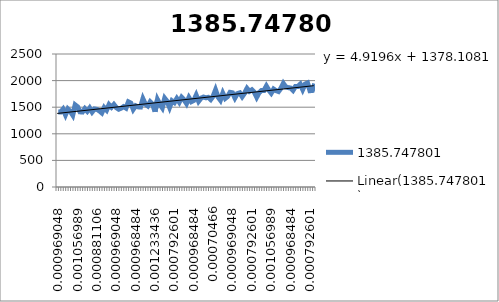
| Category | 1385.747801 |
|---|---|
| 0.000969047965337524 | 1409.71 |
| 0.000880542711958843 | 1408.997 |
| 0.000969047965337399 | 1462.603 |
| 0.000969047965337524 | 1357.679 |
| 0.00105698949098772 | 1467.266 |
| 0.00105698949098772 | 1421.77 |
| 0.0010569894909876 | 1351.802 |
| 0.000880542711958843 | 1542.5 |
| 0.00105698949098772 | 1507.457 |
| 0.000969047965337524 | 1412.852 |
| 0.0010569894909876 | 1408.801 |
| 0.000792601186308642 | 1472.939 |
| 0.000881106439687323 | 1423.314 |
| 0.000880542711958843 | 1484.858 |
| 0.000881106439687323 | 1409.553 |
| 0.000968484237609043 | 1467.141 |
| 0.000881106439687323 | 1459.688 |
| 0.000881106439687323 | 1430.484 |
| 0.000792601186308642 | 1392.604 |
| 0.000880542711958717 | 1493.375 |
| 0.000881106439687323 | 1445.967 |
| 0.00105698949098772 | 1547.773 |
| 0.000968484237609043 | 1499.581 |
| 0.000969047965337524 | 1550.429 |
| 0.000969047965337399 | 1492.231 |
| 0.00105698949098772 | 1462.196 |
| 0.000969047965337524 | 1481.269 |
| 0.000968484237609043 | 1510.302 |
| 0.000969047965337399 | 1482.758 |
| 0.000969047965337524 | 1600.337 |
| 0.000880542711958843 | 1578.2 |
| 0.000793164914037122 | 1460.535 |
| 0.000968484237609043 | 1526.82 |
| 0.000881106439687323 | 1506.313 |
| 0.000969047965337524 | 1503.179 |
| 0.000880542711958717 | 1655.981 |
| 0.000969047965337524 | 1557.419 |
| 0.000969047965337524 | 1523.858 |
| 0.000880542711958843 | 1601.222 |
| 0.000969047965337524 | 1553.901 |
| 0.00123343627001648 | 1416.081 |
| 0.000968484237609043 | 1642.636 |
| 0.000969047965337524 | 1555.288 |
| 0.000969047965337524 | 1489.379 |
| 0.000792601186308642 | 1667.171 |
| 0.000969047965337524 | 1609.043 |
| 0.000792601186308517 | 1497.294 |
| 0.000969047965337524 | 1620.021 |
| 0.000792601186308642 | 1586.993 |
| 0.000969047965337524 | 1662.9 |
| 0.000880542711958843 | 1595.267 |
| 0.000881106439687323 | 1685.742 |
| 0.000969047965337524 | 1639.141 |
| 0.000880542711958843 | 1569.628 |
| 0.0010569894909876 | 1679.928 |
| 0.000969047965337524 | 1604.396 |
| 0.000968484237609043 | 1626.188 |
| 0.000969047965337524 | 1725.29 |
| 0.0010569894909876 | 1611.026 |
| 0.000969047965337524 | 1669.185 |
| 0.000969047965337524 | 1690.929 |
| 0.000880542711958843 | 1676.825 |
| 0.000969047965337524 | 1685.695 |
| 0.0010569894909876 | 1644.423 |
| 0.000704659660658441 | 1705.606 |
| 0.000969047965337524 | 1823.468 |
| 0.000968484237609043 | 1694.448 |
| 0.000881106439687323 | 1633.115 |
| 0.000880542711958843 | 1762.48 |
| 0.000793164914037122 | 1666.082 |
| 0.000969047965337524 | 1701.657 |
| 0.000880542711958717 | 1778.936 |
| 0.000969047965337524 | 1770.646 |
| 0.00105698949098772 | 1675.085 |
| 0.00105698949098772 | 1755.287 |
| 0.0010569894909876 | 1769.76 |
| 0.000880542711958843 | 1698.233 |
| 0.000969047965337524 | 1763.013 |
| 0.00105698949098772 | 1852.618 |
| 0.000969047965337524 | 1797.985 |
| 0.000792601186308517 | 1826.728 |
| 0.000969047965337524 | 1783.966 |
| 0.000792601186308642 | 1689.417 |
| 0.000969047965337524 | 1774.453 |
| 0.000792601186308642 | 1814.778 |
| 0.000969047965337524 | 1813.054 |
| 0.000880542711958843 | 1897.025 |
| 0.000881106439687323 | 1821.548 |
| 0.0010569894909876 | 1764.385 |
| 0.000880542711958843 | 1840.888 |
| 0.00105698949098772 | 1810.578 |
| 0.000969047965337524 | 1794.694 |
| 0.0010569894909876 | 1855.078 |
| 0.000969047965337524 | 1946.494 |
| 0.000792601186308642 | 1881.165 |
| 0.000969047965337524 | 1868.525 |
| 0.000968484237609043 | 1860.117 |
| 0.000969047965337399 | 1816.314 |
| 0.000881106439687448 | 1889.22 |
| 0.000792601186308517 | 1889.957 |
| 0.000880542711958843 | 1932.31 |
| 0.000969047965337524 | 1832.895 |
| 0.000969047965337524 | 1933.815 |
| 0.000969047965337524 | 1954.894 |
| 0.000792601186308642 | 1810.084 |
| 0.0010569894909876 | 1814.911 |
| 0.000969047965337524 | 1940.946 |